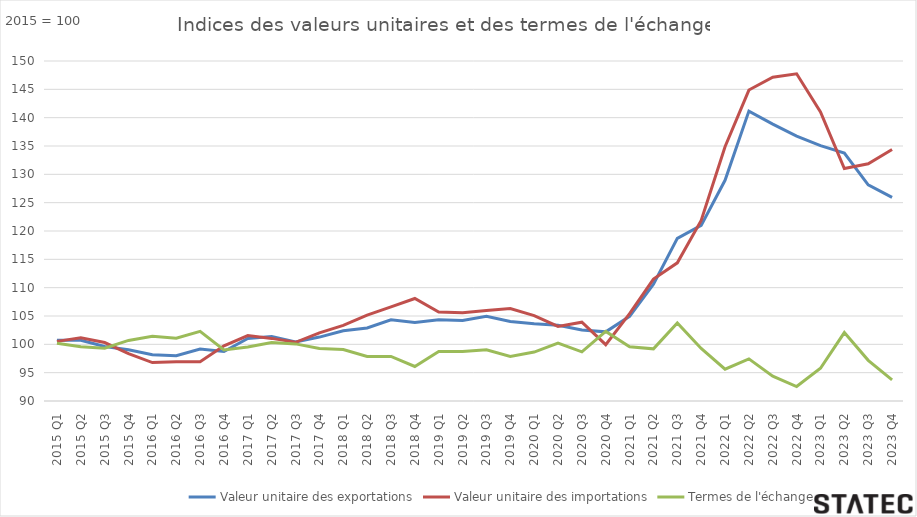
| Category | Valeur unitaire des exportations | Valeur unitaire des importations | Termes de l'échange |
|---|---|---|---|
| 2015 Q1 | 100.729 | 100.52 | 100.209 |
| 2015 Q2 | 100.722 | 101.159 | 99.567 |
| 2015 Q3 | 99.623 | 100.313 | 99.312 |
| 2015 Q4 | 99.044 | 98.362 | 100.693 |
| 2016 Q1 | 98.148 | 96.775 | 101.418 |
| 2016 Q2 | 97.999 | 96.946 | 101.086 |
| 2016 Q3 | 99.156 | 96.939 | 102.287 |
| 2016 Q4 | 98.746 | 99.742 | 99.001 |
| 2017 Q1 | 101.047 | 101.541 | 99.514 |
| 2017 Q2 | 101.37 | 101.049 | 100.317 |
| 2017 Q3 | 100.439 | 100.362 | 100.076 |
| 2017 Q4 | 101.279 | 102.035 | 99.259 |
| 2018 Q1 | 102.409 | 103.341 | 99.098 |
| 2018 Q2 | 102.896 | 105.143 | 97.863 |
| 2018 Q3 | 104.318 | 106.598 | 97.861 |
| 2018 Q4 | 103.872 | 108.092 | 96.097 |
| 2019 Q1 | 104.336 | 105.687 | 98.722 |
| 2019 Q2 | 104.196 | 105.553 | 98.715 |
| 2019 Q3 | 104.959 | 105.972 | 99.044 |
| 2019 Q4 | 104.042 | 106.305 | 97.871 |
| 2020 Q1 | 103.636 | 105.076 | 98.63 |
| 2020 Q2 | 103.382 | 103.155 | 100.221 |
| 2020 Q3 | 102.53 | 103.914 | 98.668 |
| 2020 Q4 | 102.204 | 99.938 | 102.268 |
| 2021 Q1 | 104.942 | 105.413 | 99.553 |
| 2021 Q2 | 110.615 | 111.507 | 99.2 |
| 2021 Q3 | 118.691 | 114.382 | 103.767 |
| 2021 Q4 | 120.986 | 121.87 | 99.274 |
| 2022 Q1 | 128.951 | 134.864 | 95.616 |
| 2022 Q2 | 141.155 | 144.874 | 97.433 |
| 2022 Q3 | 138.871 | 147.132 | 94.385 |
| 2022 Q4 | 136.73 | 147.737 | 92.549 |
| 2023 Q1 | 135.056 | 140.998 | 95.786 |
| 2023 Q2 | 133.754 | 131.031 | 102.078 |
| 2023 Q3 | 128.15 | 131.874 | 97.176 |
| 2023 Q4 | 125.947 | 134.376 | 93.727 |